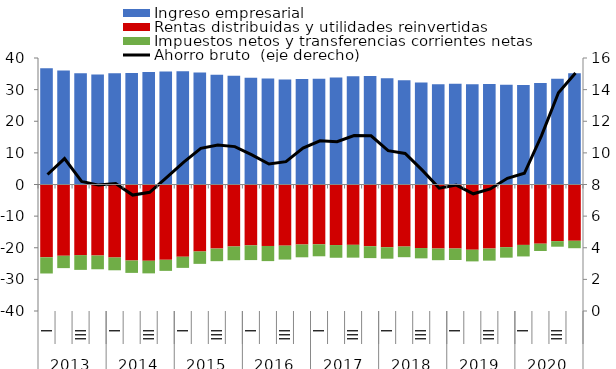
| Category | Ingreso empresarial | Rentas distribuidas y utilidades reinvertidas | Impuestos netos y transferencias corrientes netas |
|---|---|---|---|
| 0 | 36.77 | -23.021 | -5.116 |
| 1 | 36.078 | -22.544 | -3.895 |
| 2 | 35.19 | -22.334 | -4.662 |
| 3 | 34.766 | -22.459 | -4.345 |
| 4 | 35.189 | -23.07 | -4.056 |
| 5 | 35.281 | -24.035 | -3.914 |
| 6 | 35.607 | -24.121 | -3.978 |
| 7 | 35.755 | -23.823 | -3.489 |
| 8 | 35.777 | -22.84 | -3.525 |
| 9 | 35.379 | -21.17 | -3.924 |
| 10 | 34.742 | -20.276 | -3.969 |
| 11 | 34.349 | -19.597 | -4.354 |
| 12 | 33.768 | -19.234 | -4.665 |
| 13 | 33.516 | -19.437 | -4.787 |
| 14 | 33.184 | -19.337 | -4.4 |
| 15 | 33.327 | -18.974 | -4.046 |
| 16 | 33.464 | -18.906 | -3.791 |
| 17 | 33.868 | -19.147 | -4.019 |
| 18 | 34.226 | -19.078 | -4.051 |
| 19 | 34.347 | -19.52 | -3.751 |
| 20 | 33.597 | -19.842 | -3.616 |
| 21 | 32.954 | -19.625 | -3.363 |
| 22 | 32.268 | -20.093 | -3.264 |
| 23 | 31.702 | -20.257 | -3.678 |
| 24 | 31.844 | -20.25 | -3.628 |
| 25 | 31.723 | -20.618 | -3.694 |
| 26 | 31.792 | -20.265 | -3.808 |
| 27 | 31.527 | -19.821 | -3.313 |
| 28 | 31.454 | -19.103 | -3.643 |
| 29 | 32.102 | -18.719 | -2.311 |
| 30 | 33.468 | -17.914 | -1.754 |
| 31 | 35.197 | -17.793 | -2.354 |